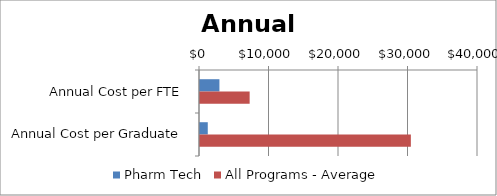
| Category | Pharm Tech | All Programs - Average |
|---|---|---|
| Annual Cost per FTE | 2795.026 | 7144 |
| Annual Cost per Graduate | 1118.011 | 30340 |